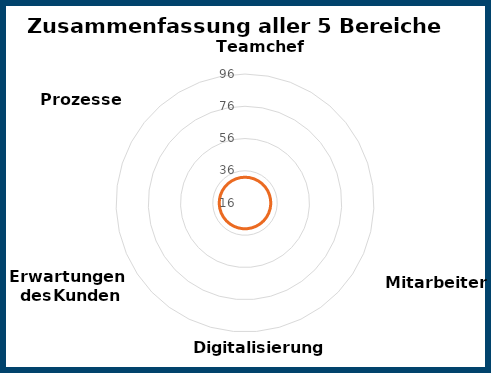
| Category | Series 0 |
|---|---|
| 0 | 0 |
| 1 | 0 |
| 2 | 0 |
| 3 | 0 |
| 4 | 0 |
| 5 | 0 |
| 6 | 0 |
| 7 | 0 |
| 8 | 0 |
| 9 | 0 |
| 10 | 0 |
| 11 | 0 |
| 12 | 0 |
| 13 | 0 |
| 14 | 0 |
| 15 | 0 |
| 16 | 0 |
| 17 | 0 |
| 18 | 0 |
| 19 | 0 |
| 20 | 0 |
| 21 | 0 |
| 22 | 0 |
| 23 | 0 |
| 24 | 0 |
| 25 | 0 |
| 26 | 0 |
| 27 | 0 |
| 28 | 0 |
| 29 | 0 |
| 30 | 0 |
| 31 | 0 |
| 32 | 0 |
| 33 | 0 |
| 34 | 0 |